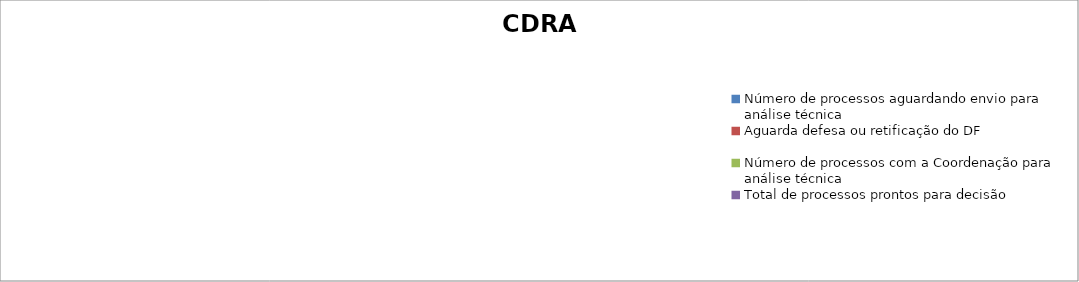
| Category | CDRA |
|---|---|
| Número de processos aguardando envio para análise técnica | 0 |
| Aguarda defesa ou retificação do DF | 0 |
| Número de processos com a Coordenação para análise técnica | 0 |
| Total de processos prontos para decisão | 0 |